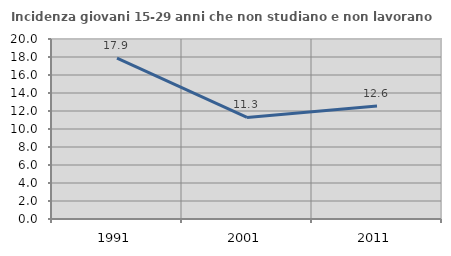
| Category | Incidenza giovani 15-29 anni che non studiano e non lavorano  |
|---|---|
| 1991.0 | 17.871 |
| 2001.0 | 11.284 |
| 2011.0 | 12.551 |